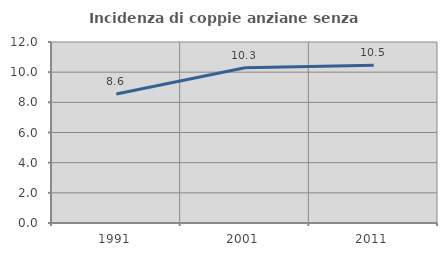
| Category | Incidenza di coppie anziane senza figli  |
|---|---|
| 1991.0 | 8.55 |
| 2001.0 | 10.292 |
| 2011.0 | 10.459 |